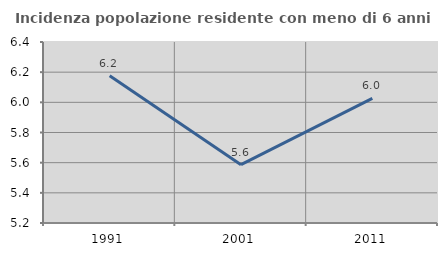
| Category | Incidenza popolazione residente con meno di 6 anni |
|---|---|
| 1991.0 | 6.176 |
| 2001.0 | 5.587 |
| 2011.0 | 6.026 |